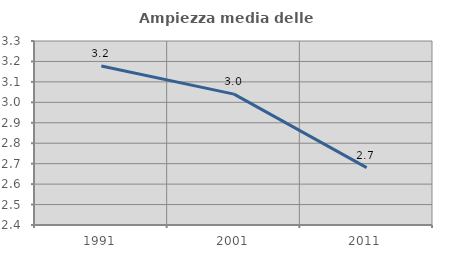
| Category | Ampiezza media delle famiglie |
|---|---|
| 1991.0 | 3.178 |
| 2001.0 | 3.04 |
| 2011.0 | 2.68 |